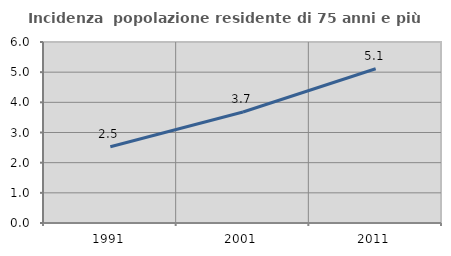
| Category | Incidenza  popolazione residente di 75 anni e più |
|---|---|
| 1991.0 | 2.526 |
| 2001.0 | 3.681 |
| 2011.0 | 5.112 |